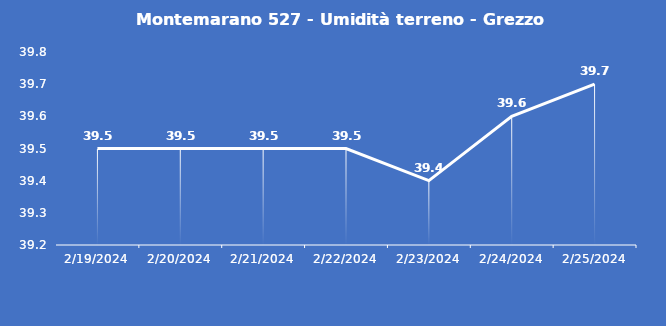
| Category | Montemarano 527 - Umidità terreno - Grezzo (%VWC) |
|---|---|
| 2/19/24 | 39.5 |
| 2/20/24 | 39.5 |
| 2/21/24 | 39.5 |
| 2/22/24 | 39.5 |
| 2/23/24 | 39.4 |
| 2/24/24 | 39.6 |
| 2/25/24 | 39.7 |